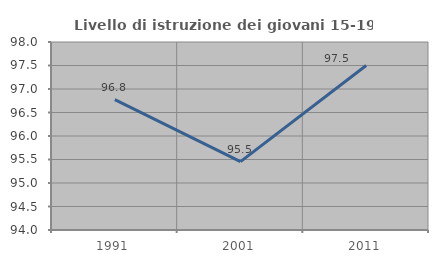
| Category | Livello di istruzione dei giovani 15-19 anni |
|---|---|
| 1991.0 | 96.774 |
| 2001.0 | 95.455 |
| 2011.0 | 97.5 |